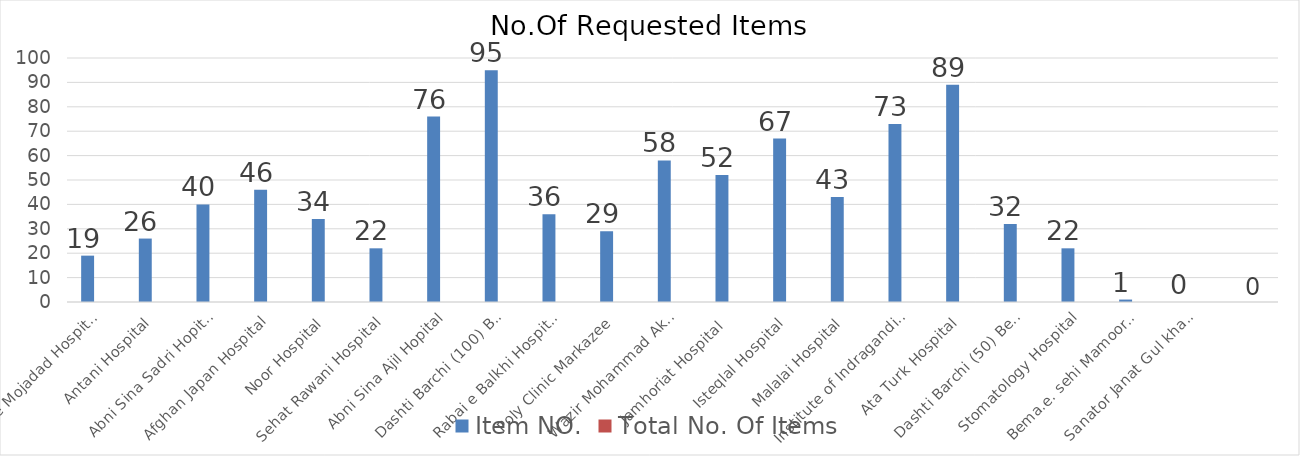
| Category | Item NO. | Total No. Of Items |
|---|---|---|
| Ehye Mojadad Hospital | 19 |  |
| Antani Hospital | 26 |  |
| Abni Sina Sadri Hopital | 40 |  |
| Afghan Japan Hospital | 46 |  |
| Noor Hospital | 34 |  |
| Sehat Rawani Hospital | 22 |  |
| Abni Sina Ajil Hopital | 76 |  |
| Dashti Barchi (100) Beds | 95 |  |
| Rabai e Balkhi Hospital | 36 |  |
| Poly Clinic Markazee | 29 |  |
| Wazir Mohammad Akbarkhan Hospital | 58 |  |
| Jamhoriat Hospital  | 52 |  |
| Isteqlal Hospital | 67 |  |
| Malalai Hospital | 43 |  |
| Institute of Indragandi Child  Health | 73 |  |
| Ata Turk Hospital | 89 |  |
| Dashti Barchi (50) Beds | 32 |  |
| Stomatology Hospital | 22 |  |
| Bema.e. sehi Mamoorin | 1 |  |
| Sanator Janat Gul khan Hopital | 0 |  |